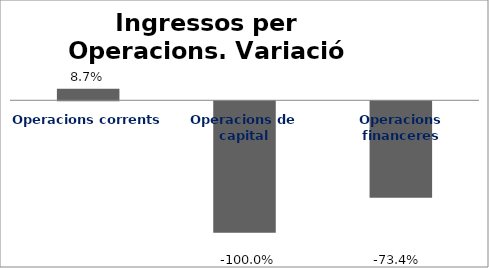
| Category | Series 0 |
|---|---|
| Operacions corrents | 0.087 |
| Operacions de capital | -1 |
| Operacions financeres | -0.734 |